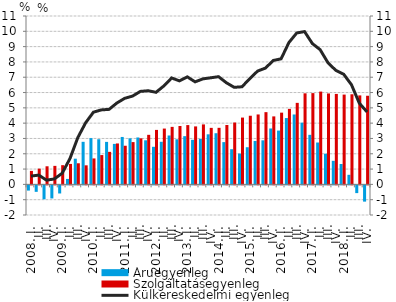
| Category | Áruegyenleg | Szolgáltatásegyenleg |
|---|---|---|
| 2008. I. | -0.339 | 0.881 |
|          II. | -0.422 | 1.028 |
|          III. | -0.907 | 1.183 |
|          IV. | -0.854 | 1.21 |
| 2009. I. | -0.529 | 1.256 |
|          II. | 0.357 | 1.337 |
|          III. | 1.679 | 1.379 |
|          IV. | 2.781 | 1.245 |
| 2010. I. | 3.022 | 1.695 |
|          II. | 2.95 | 1.915 |
|          III. | 2.777 | 2.125 |
|          IV. | 2.645 | 2.674 |
| 2011. I. | 3.099 | 2.524 |
|          II. | 3.007 | 2.762 |
|          III. | 3.065 | 3.009 |
|          IV. | 2.881 | 3.237 |
| 2012. I. | 2.455 | 3.559 |
|          II. | 2.783 | 3.647 |
|          III. | 3.194 | 3.757 |
|          IV. | 2.946 | 3.815 |
| 2013. I. | 3.15 | 3.874 |
| II. | 2.912 | 3.787 |
|          III. | 2.974 | 3.919 |
| IV. | 3.271 | 3.692 |
| 2014. I. | 3.342 | 3.695 |
| II. | 2.761 | 3.879 |
|          III. | 2.298 | 4.042 |
| IV. | 2.013 | 4.364 |
| 2015. I. | 2.427 | 4.484 |
| II. | 2.836 | 4.568 |
|          III. | 2.878 | 4.719 |
| IV. | 3.653 | 4.442 |
| 2016. I. | 3.515 | 4.687 |
| II. | 4.333 | 4.933 |
|          III. | 4.567 | 5.325 |
| IV. | 4.032 | 5.949 |
| 2017. I. | 3.237 | 5.963 |
| II. | 2.736 | 6.062 |
|          III. | 2.003 | 5.94 |
| IV. | 1.539 | 5.909 |
| 2018. I. | 1.333 | 5.866 |
| II. | 0.626 | 5.887 |
|          III. | -0.505 | 5.813 |
| IV. | -1.061 | 5.79 |